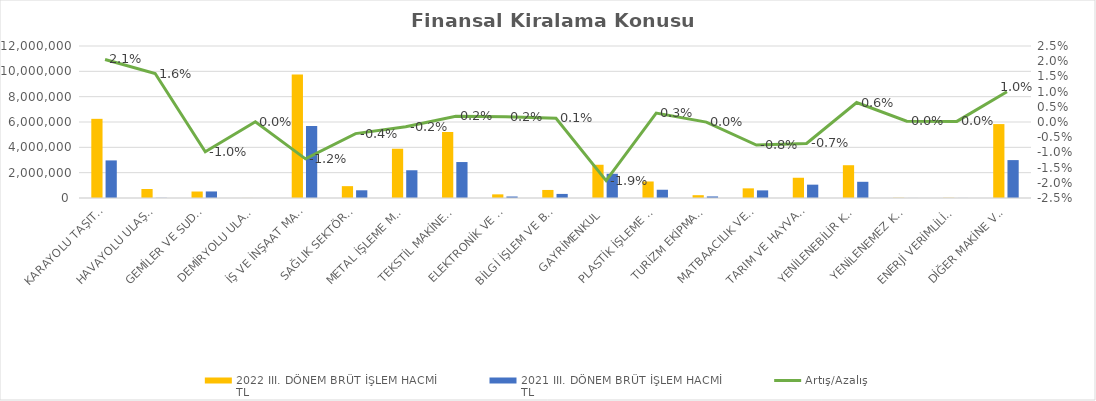
| Category | 2022 III. DÖNEM BRÜT İŞLEM HACMİ 
TL | 2021 III. DÖNEM BRÜT İŞLEM HACMİ 
TL |
|---|---|---|
| KARAYOLU TAŞITLARI | 6249692.014 | 2967853.993 |
| HAVAYOLU ULAŞIM ARAÇLARI | 710489 | 12757 |
| GEMİLER VE SUDA YÜZEN TAŞIT VE ARAÇLAR | 511733.318 | 516931.098 |
| DEMİRYOLU ULAŞIM ARAÇLARI | 3944 | 293 |
| İŞ VE İNŞAAT MAKİNELERİ | 9741021.203 | 5680976.457 |
| SAĞLIK SEKTÖRÜ VE ESTETİK EKİPMANLARI | 935328.65 | 609011.559 |
| METAL İŞLEME MAKİNELERİ | 3889618.72 | 2190474.218 |
| TEKSTİL MAKİNELERİ | 5210920.283 | 2839234.288 |
| ELEKTRONİK VE OPTİK CİHAZLAR | 287703.771 | 117560.782 |
| BİLGİ İŞLEM VE BÜRO SİSTEMLERİ | 635054.48 | 321937.527 |
| GAYRİMENKUL | 2624353.991 | 1912992.305 |
| PLASTİK İŞLEME MAKİNELERİ | 1303954.526 | 651604.318 |
| TURİZM EKİPMANLARI | 222090.276 | 123802.974 |
| MATBAACILIK VE KAĞIT İŞLEME MAKİNELERİ | 761664.165 | 602172.452 |
| TARIM VE HAYVANCILIK MAKİNELERİ | 1598284.433 | 1053192.501 |
| YENİLENEBİLİR KAYNAKLI ELEKTRİK ENERJİSİ ÜRETİM EKİPMANLARI | 2587958.204 | 1279280.813 |
| YENİLENEMEZ KAYNAKLI ELEKTRİK ENERJİSİ ÜRETİM EKİPMANLARI | 16340.788 | 2857 |
| ENERJİ VERİMLİLİĞİ EKİPMANLARI | 15111.342 | 3661.684 |
| DİĞER MAKİNE VE EKİPMANLAR | 5836067.32 | 2992170.921 |